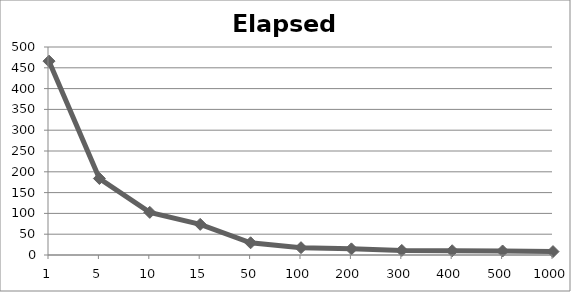
| Category | Elapsed (s) |
|---|---|
| 1.0 | 465.98 |
| 5.0 | 183.87 |
| 10.0 | 102.5 |
| 15.0 | 73.65 |
| 50.0 | 29.4 |
| 100.0 | 17.59 |
| 200.0 | 14.76 |
| 300.0 | 11 |
| 400.0 | 10.23 |
| 500.0 | 9.64 |
| 1000.0 | 8.21 |